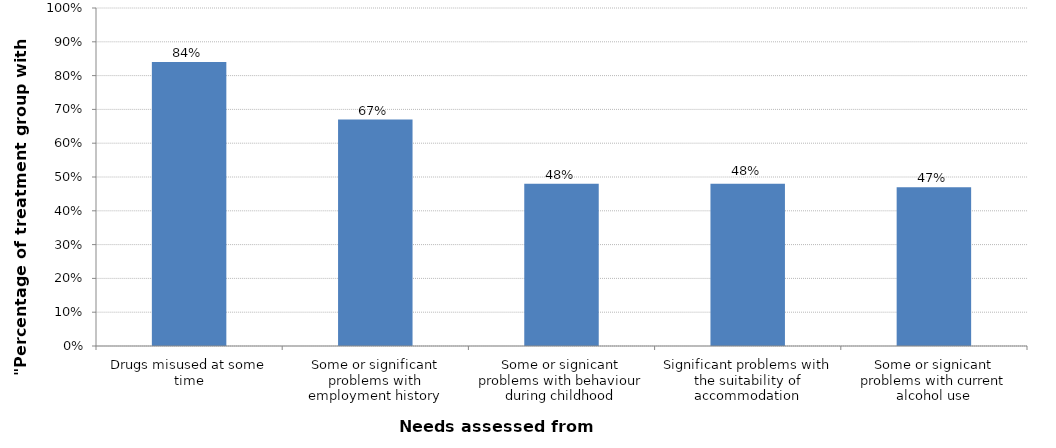
| Category | Series 0 |
|---|---|
| Drugs misused at some time | 0.84 |
| Some or significant problems with employment history | 0.67 |
| Some or signicant problems with behaviour during childhood | 0.48 |
| Significant problems with the suitability of accommodation | 0.48 |
| Some or signicant problems with current alcohol use | 0.47 |